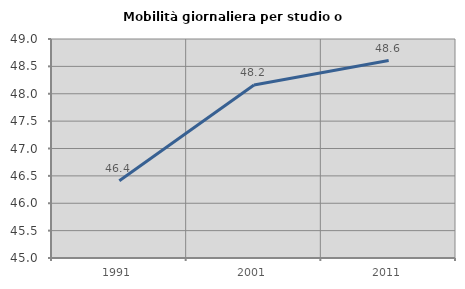
| Category | Mobilità giornaliera per studio o lavoro |
|---|---|
| 1991.0 | 46.411 |
| 2001.0 | 48.158 |
| 2011.0 | 48.607 |